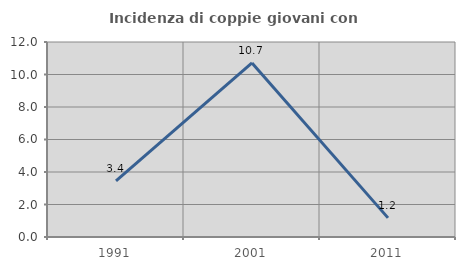
| Category | Incidenza di coppie giovani con figli |
|---|---|
| 1991.0 | 3.448 |
| 2001.0 | 10.714 |
| 2011.0 | 1.176 |